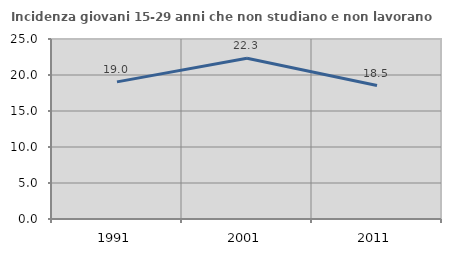
| Category | Incidenza giovani 15-29 anni che non studiano e non lavorano  |
|---|---|
| 1991.0 | 19.048 |
| 2001.0 | 22.329 |
| 2011.0 | 18.535 |